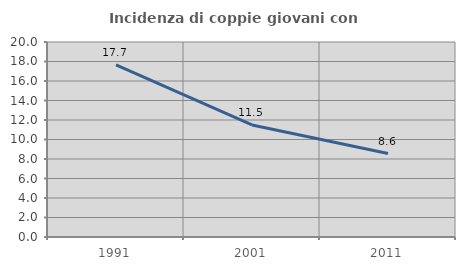
| Category | Incidenza di coppie giovani con figli |
|---|---|
| 1991.0 | 17.658 |
| 2001.0 | 11.495 |
| 2011.0 | 8.558 |